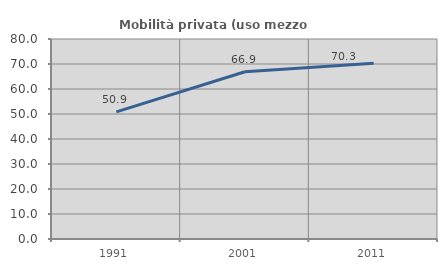
| Category | Mobilità privata (uso mezzo privato) |
|---|---|
| 1991.0 | 50.866 |
| 2001.0 | 66.893 |
| 2011.0 | 70.283 |